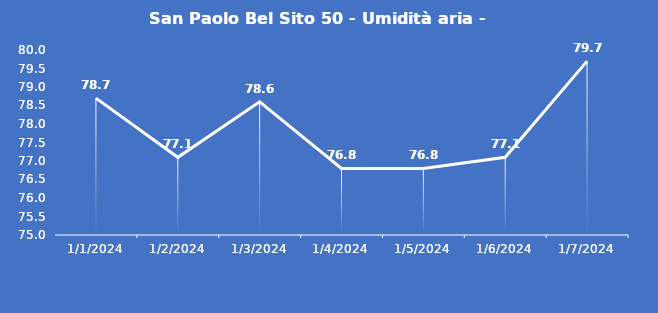
| Category | San Paolo Bel Sito 50 - Umidità aria - Grezzo (%) |
|---|---|
| 1/1/24 | 78.7 |
| 1/2/24 | 77.1 |
| 1/3/24 | 78.6 |
| 1/4/24 | 76.8 |
| 1/5/24 | 76.8 |
| 1/6/24 | 77.1 |
| 1/7/24 | 79.7 |